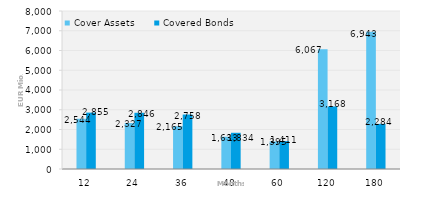
| Category | Cover Assets | Covered Bonds |
|---|---|---|
| 12.0 | 2544.342 | 2855.434 |
| 24.0 | 2326.96 | 2846.034 |
| 36.0 | 2164.843 | 2757.765 |
| 48.0 | 1633.352 | 1834.177 |
| 60.0 | 1394.658 | 1410.551 |
| 120.0 | 6066.936 | 3167.851 |
| 180.0 | 6943.072 | 2284.478 |